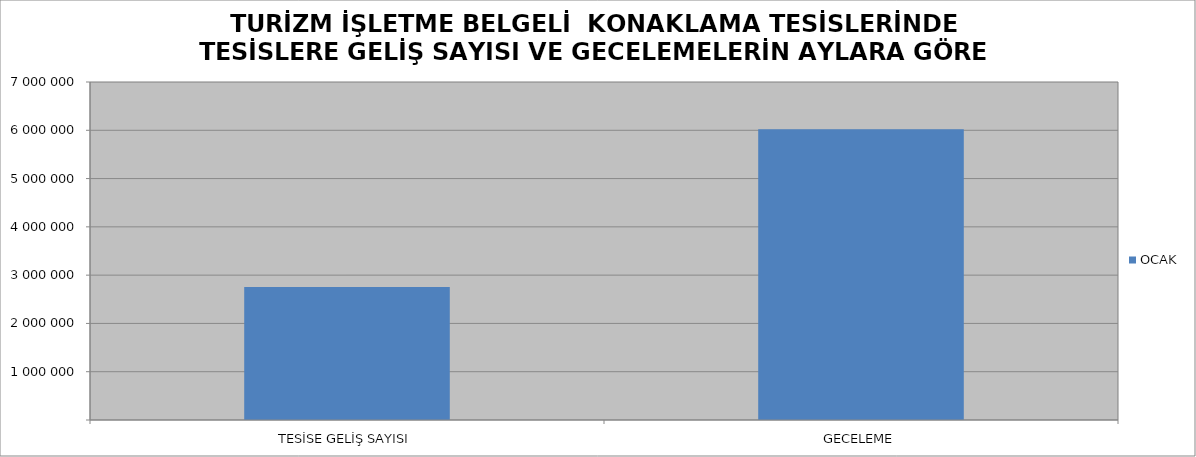
| Category | OCAK |
|---|---|
| TESİSE GELİŞ SAYISI | 2752012 |
| GECELEME | 6020345 |